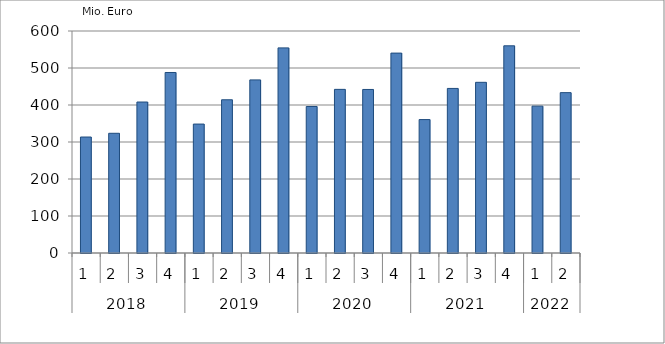
| Category | Ausbaugewerblicher Umsatz3 |
|---|---|
| 0 | 313433.569 |
| 1 | 323547.694 |
| 2 | 408057.42 |
| 3 | 487843.765 |
| 4 | 348466.115 |
| 5 | 414145.554 |
| 6 | 467849.207 |
| 7 | 554369.34 |
| 8 | 395996.128 |
| 9 | 442270.528 |
| 10 | 441987.109 |
| 11 | 540250.513 |
| 12 | 360578.959 |
| 13 | 444796.964 |
| 14 | 461290.095 |
| 15 | 559989.337 |
| 16 | 396959.135 |
| 17 | 433420.546 |